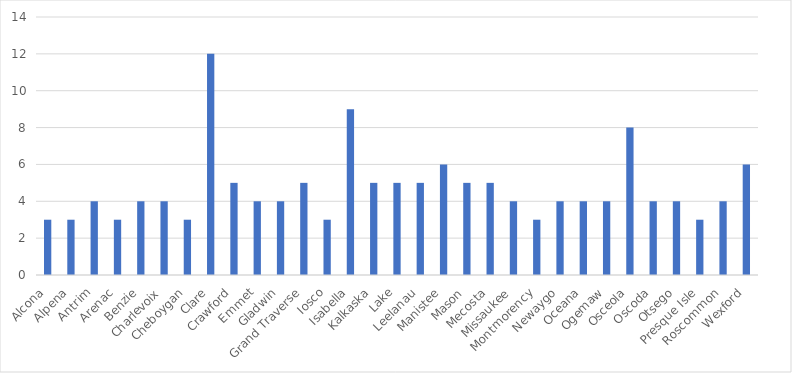
| Category | Number of Responses |
|---|---|
| Alcona | 3 |
| Alpena | 3 |
| Antrim | 4 |
| Arenac | 3 |
| Benzie | 4 |
| Charlevoix | 4 |
| Cheboygan | 3 |
| Clare | 12 |
| Crawford | 5 |
| Emmet | 4 |
| Gladwin | 4 |
| Grand Traverse | 5 |
| Iosco | 3 |
| Isabella | 9 |
| Kalkaska | 5 |
| Lake | 5 |
| Leelanau | 5 |
| Manistee | 6 |
| Mason | 5 |
| Mecosta | 5 |
| Missaukee | 4 |
| Montmorency | 3 |
| Newaygo | 4 |
| Oceana | 4 |
| Ogemaw | 4 |
| Osceola | 8 |
| Oscoda | 4 |
| Otsego | 4 |
| Presque Isle | 3 |
| Roscommon | 4 |
| Wexford | 6 |